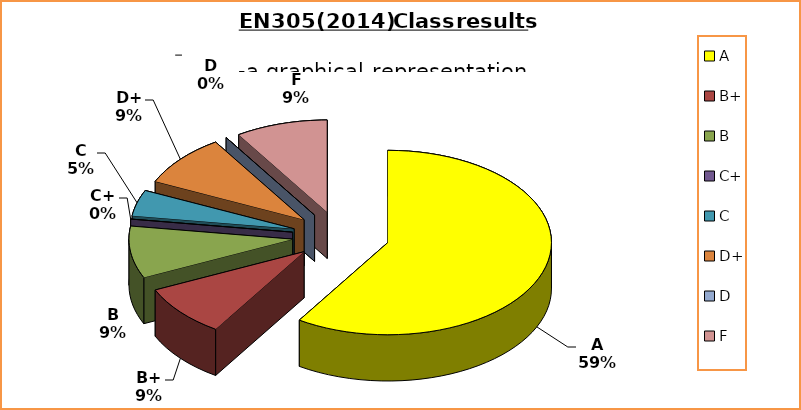
| Category | Series 0 |
|---|---|
| A | 13 |
| B+ | 2 |
| B | 2 |
| C+ | 0 |
| C | 1 |
| D+ | 2 |
| D | 0 |
| F | 2 |